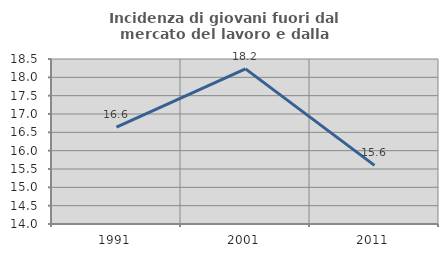
| Category | Incidenza di giovani fuori dal mercato del lavoro e dalla formazione  |
|---|---|
| 1991.0 | 16.642 |
| 2001.0 | 18.23 |
| 2011.0 | 15.598 |